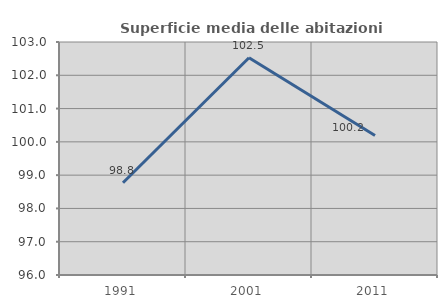
| Category | Superficie media delle abitazioni occupate |
|---|---|
| 1991.0 | 98.771 |
| 2001.0 | 102.528 |
| 2011.0 | 100.189 |